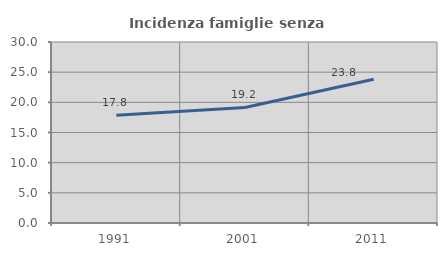
| Category | Incidenza famiglie senza nuclei |
|---|---|
| 1991.0 | 17.839 |
| 2001.0 | 19.157 |
| 2011.0 | 23.83 |